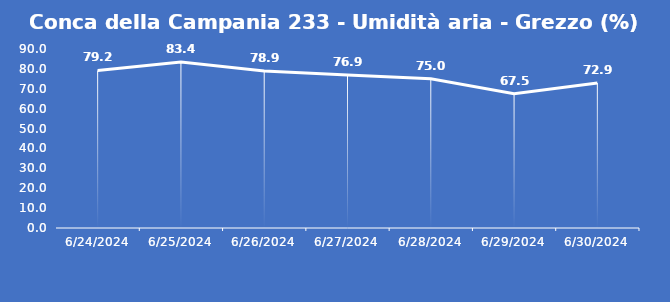
| Category | Conca della Campania 233 - Umidità aria - Grezzo (%) |
|---|---|
| 6/24/24 | 79.2 |
| 6/25/24 | 83.4 |
| 6/26/24 | 78.9 |
| 6/27/24 | 76.9 |
| 6/28/24 | 75 |
| 6/29/24 | 67.5 |
| 6/30/24 | 72.9 |